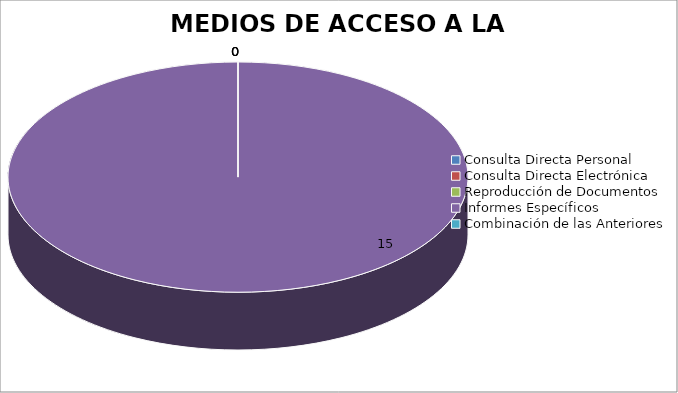
| Category | MEDIOS DE ACCESO A LA INFORMACIÓN |
|---|---|
| 0 | 0 |
| 1 | 0 |
| 2 | 0 |
| 3 | 15 |
| 4 | 0 |